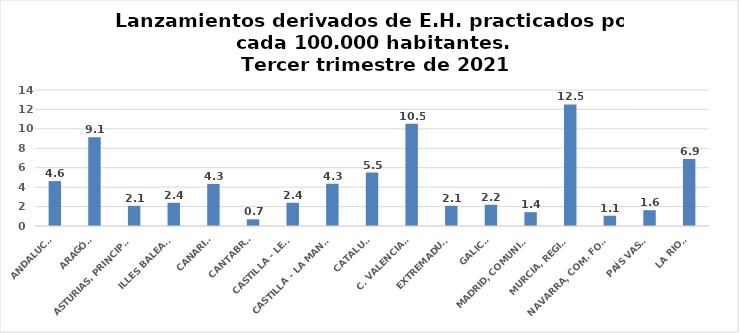
| Category | Series 0 |
|---|---|
| ANDALUCÍA | 4.621 |
| ARAGÓN | 9.13 |
| ASTURIAS, PRINCIPADO | 2.076 |
| ILLES BALEARS | 2.388 |
| CANARIAS | 4.329 |
| CANTABRIA | 0.685 |
| CASTILLA - LEÓN | 2.394 |
| CASTILLA - LA MANCHA | 4.346 |
| CATALUÑA | 5.505 |
| C. VALENCIANA | 10.516 |
| EXTREMADURA | 2.078 |
| GALICIA | 2.19 |
| MADRID, COMUNIDAD | 1.423 |
| MURCIA, REGIÓN | 12.517 |
| NAVARRA, COM. FORAL | 1.059 |
| PAÍS VASCO | 1.627 |
| LA RIOJA | 6.892 |